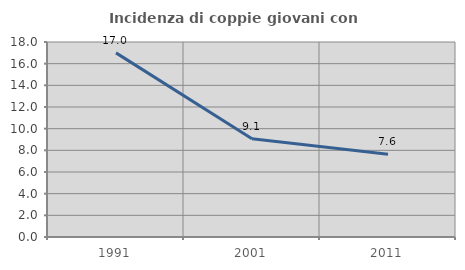
| Category | Incidenza di coppie giovani con figli |
|---|---|
| 1991.0 | 16.997 |
| 2001.0 | 9.064 |
| 2011.0 | 7.645 |